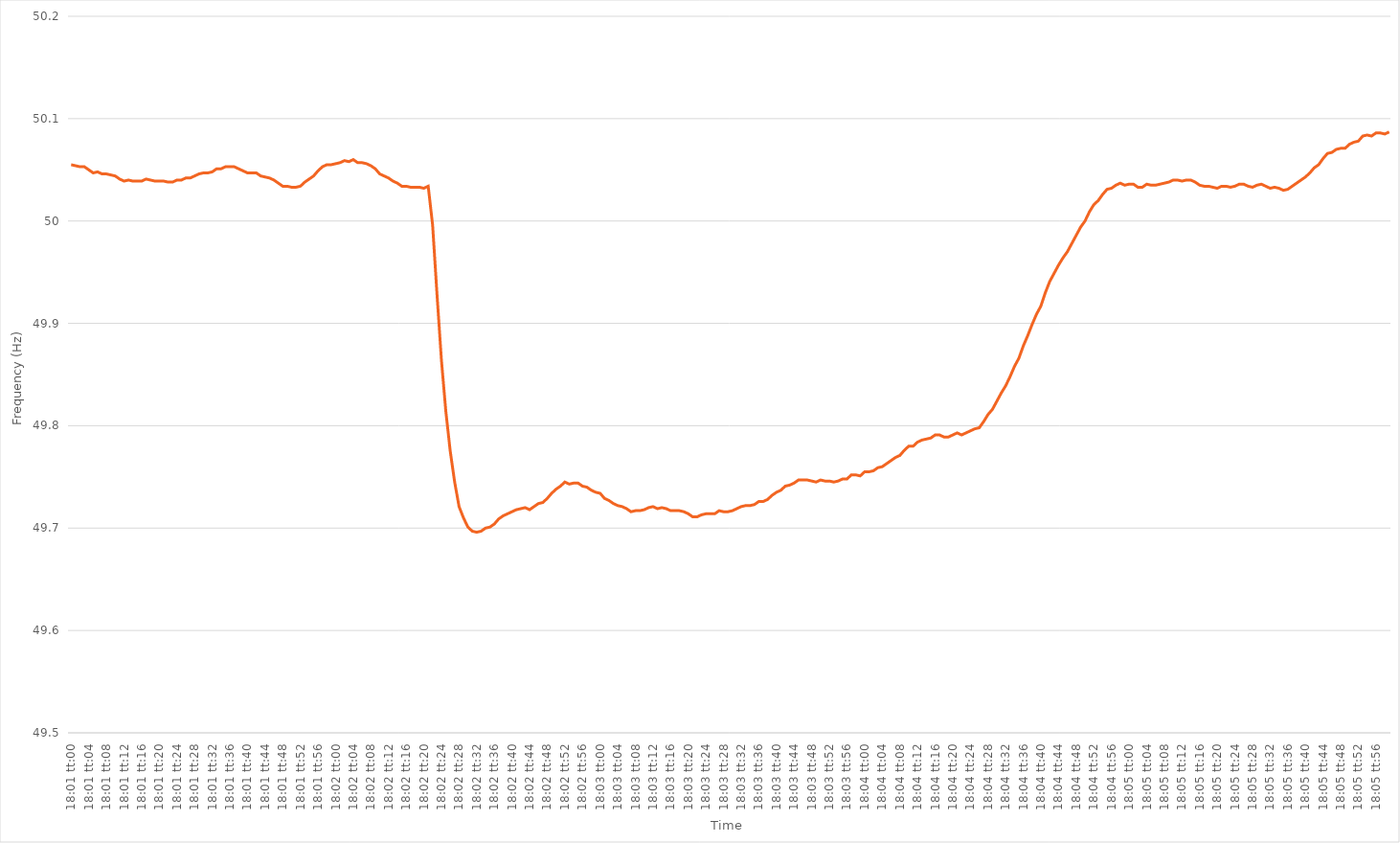
| Category | Series 0 |
|---|---|
| 0.7506944444444444 | 50.055 |
| 0.7507060185185185 | 50.054 |
| 0.7507175925925926 | 50.053 |
| 0.7507291666666666 | 50.053 |
| 0.7507407407407407 | 50.05 |
| 0.7507523148148149 | 50.047 |
| 0.7507638888888889 | 50.048 |
| 0.7507754629629629 | 50.046 |
| 0.750787037037037 | 50.046 |
| 0.7507986111111111 | 50.045 |
| 0.7508101851851853 | 50.044 |
| 0.7508217592592592 | 50.041 |
| 0.7508333333333334 | 50.039 |
| 0.7508449074074074 | 50.04 |
| 0.7508564814814815 | 50.039 |
| 0.7508680555555555 | 50.039 |
| 0.7508796296296296 | 50.039 |
| 0.7508912037037038 | 50.041 |
| 0.7509027777777778 | 50.04 |
| 0.7509143518518518 | 50.039 |
| 0.7509259259259259 | 50.039 |
| 0.7509375 | 50.039 |
| 0.750949074074074 | 50.038 |
| 0.7509606481481481 | 50.038 |
| 0.7509722222222223 | 50.04 |
| 0.7509837962962963 | 50.04 |
| 0.7509953703703703 | 50.042 |
| 0.7510069444444444 | 50.042 |
| 0.7510185185185185 | 50.044 |
| 0.7510300925925927 | 50.046 |
| 0.7510416666666666 | 50.047 |
| 0.7510532407407408 | 50.047 |
| 0.7510648148148148 | 50.048 |
| 0.751076388888889 | 50.051 |
| 0.7510879629629629 | 50.051 |
| 0.751099537037037 | 50.053 |
| 0.7511111111111112 | 50.053 |
| 0.7511226851851852 | 50.053 |
| 0.7511342592592593 | 50.051 |
| 0.7511458333333333 | 50.049 |
| 0.7511574074074074 | 50.047 |
| 0.7511689814814816 | 50.047 |
| 0.7511805555555555 | 50.047 |
| 0.7511921296296297 | 50.044 |
| 0.7512037037037037 | 50.043 |
| 0.7512152777777777 | 50.042 |
| 0.7512268518518518 | 50.04 |
| 0.7512384259259259 | 50.037 |
| 0.7512500000000001 | 50.034 |
| 0.751261574074074 | 50.034 |
| 0.7512731481481482 | 50.033 |
| 0.7512847222222222 | 50.033 |
| 0.7512962962962964 | 50.034 |
| 0.7513078703703703 | 50.038 |
| 0.7513194444444444 | 50.041 |
| 0.7513310185185186 | 50.044 |
| 0.7513425925925926 | 50.049 |
| 0.7513541666666667 | 50.053 |
| 0.7513657407407407 | 50.055 |
| 0.7513773148148148 | 50.055 |
| 0.751388888888889 | 50.056 |
| 0.7514004629629629 | 50.057 |
| 0.7514120370370371 | 50.059 |
| 0.7514236111111111 | 50.058 |
| 0.7514351851851852 | 50.06 |
| 0.7514467592592592 | 50.057 |
| 0.7514583333333333 | 50.057 |
| 0.7514699074074075 | 50.056 |
| 0.7514814814814814 | 50.054 |
| 0.7514930555555556 | 50.051 |
| 0.7515046296296296 | 50.046 |
| 0.7515162037037038 | 50.044 |
| 0.7515277777777777 | 50.042 |
| 0.7515393518518518 | 50.039 |
| 0.751550925925926 | 50.037 |
| 0.7515625 | 50.034 |
| 0.7515740740740741 | 50.034 |
| 0.7515856481481481 | 50.033 |
| 0.7515972222222222 | 50.033 |
| 0.7516087962962964 | 50.033 |
| 0.7516203703703703 | 50.032 |
| 0.7516319444444445 | 50.034 |
| 0.7516435185185185 | 49.996 |
| 0.7516550925925927 | 49.928 |
| 0.7516666666666666 | 49.864 |
| 0.7516782407407407 | 49.814 |
| 0.7516898148148149 | 49.775 |
| 0.7517013888888888 | 49.745 |
| 0.751712962962963 | 49.721 |
| 0.751724537037037 | 49.71 |
| 0.7517361111111112 | 49.701 |
| 0.7517476851851851 | 49.697 |
| 0.7517592592592592 | 49.696 |
| 0.7517708333333334 | 49.697 |
| 0.7517824074074074 | 49.7 |
| 0.7517939814814815 | 49.701 |
| 0.7518055555555555 | 49.704 |
| 0.7518171296296297 | 49.709 |
| 0.7518287037037038 | 49.712 |
| 0.7518402777777777 | 49.714 |
| 0.7518518518518519 | 49.716 |
| 0.7518634259259259 | 49.718 |
| 0.7518750000000001 | 49.719 |
| 0.751886574074074 | 49.72 |
| 0.7518981481481481 | 49.718 |
| 0.7519097222222223 | 49.721 |
| 0.7519212962962962 | 49.724 |
| 0.7519328703703704 | 49.725 |
| 0.7519444444444444 | 49.729 |
| 0.7519560185185186 | 49.734 |
| 0.7519675925925925 | 49.738 |
| 0.7519791666666666 | 49.741 |
| 0.7519907407407408 | 49.745 |
| 0.7520023148148148 | 49.743 |
| 0.7520138888888889 | 49.744 |
| 0.7520254629629629 | 49.744 |
| 0.7520370370370371 | 49.741 |
| 0.7520486111111112 | 49.74 |
| 0.7520601851851851 | 49.737 |
| 0.7520717592592593 | 49.735 |
| 0.7520833333333333 | 49.734 |
| 0.7520949074074075 | 49.729 |
| 0.7521064814814814 | 49.727 |
| 0.7521180555555556 | 49.724 |
| 0.7521296296296297 | 49.722 |
| 0.7521412037037036 | 49.721 |
| 0.7521527777777778 | 49.719 |
| 0.7521643518518518 | 49.716 |
| 0.752175925925926 | 49.717 |
| 0.7521874999999999 | 49.717 |
| 0.752199074074074 | 49.718 |
| 0.7522106481481482 | 49.72 |
| 0.7522222222222222 | 49.721 |
| 0.7522337962962963 | 49.719 |
| 0.7522453703703703 | 49.72 |
| 0.7522569444444445 | 49.719 |
| 0.7522685185185186 | 49.717 |
| 0.7522800925925925 | 49.717 |
| 0.7522916666666667 | 49.717 |
| 0.7523032407407407 | 49.716 |
| 0.7523148148148149 | 49.714 |
| 0.7523263888888888 | 49.711 |
| 0.752337962962963 | 49.711 |
| 0.7523495370370371 | 49.713 |
| 0.7523611111111111 | 49.714 |
| 0.7523726851851852 | 49.714 |
| 0.7523842592592592 | 49.714 |
| 0.7523958333333334 | 49.717 |
| 0.7524074074074073 | 49.716 |
| 0.7524189814814815 | 49.716 |
| 0.7524305555555556 | 49.717 |
| 0.7524421296296296 | 49.719 |
| 0.7524537037037037 | 49.721 |
| 0.7524652777777777 | 49.722 |
| 0.7524768518518519 | 49.722 |
| 0.752488425925926 | 49.723 |
| 0.7525 | 49.726 |
| 0.7525115740740741 | 49.726 |
| 0.7525231481481481 | 49.728 |
| 0.7525347222222223 | 49.732 |
| 0.7525462962962962 | 49.735 |
| 0.7525578703703704 | 49.737 |
| 0.7525694444444445 | 49.741 |
| 0.7525810185185186 | 49.742 |
| 0.7525925925925926 | 49.744 |
| 0.7526041666666666 | 49.747 |
| 0.7526157407407408 | 49.747 |
| 0.7526273148148147 | 49.747 |
| 0.7526388888888889 | 49.746 |
| 0.752650462962963 | 49.745 |
| 0.752662037037037 | 49.747 |
| 0.7526736111111111 | 49.746 |
| 0.7526851851851851 | 49.746 |
| 0.7526967592592593 | 49.745 |
| 0.7527083333333334 | 49.746 |
| 0.7527199074074074 | 49.748 |
| 0.7527314814814815 | 49.748 |
| 0.7527430555555555 | 49.752 |
| 0.7527546296296297 | 49.752 |
| 0.7527662037037036 | 49.751 |
| 0.7527777777777778 | 49.755 |
| 0.7527893518518519 | 49.755 |
| 0.752800925925926 | 49.756 |
| 0.7528125 | 49.759 |
| 0.752824074074074 | 49.76 |
| 0.7528356481481482 | 49.763 |
| 0.7528472222222221 | 49.766 |
| 0.7528587962962963 | 49.769 |
| 0.7528703703703704 | 49.771 |
| 0.7528819444444445 | 49.776 |
| 0.7528935185185185 | 49.78 |
| 0.7529050925925925 | 49.78 |
| 0.7529166666666667 | 49.784 |
| 0.7529282407407408 | 49.786 |
| 0.7529398148148148 | 49.787 |
| 0.7529513888888889 | 49.788 |
| 0.752962962962963 | 49.791 |
| 0.7529745370370371 | 49.791 |
| 0.752986111111111 | 49.789 |
| 0.7529976851851852 | 49.789 |
| 0.7530092592592593 | 49.791 |
| 0.7530208333333334 | 49.793 |
| 0.7530324074074074 | 49.791 |
| 0.7530439814814814 | 49.793 |
| 0.7530555555555556 | 49.795 |
| 0.7530671296296297 | 49.797 |
| 0.7530787037037037 | 49.798 |
| 0.7530902777777778 | 49.804 |
| 0.7531018518518519 | 49.811 |
| 0.7531134259259259 | 49.816 |
| 0.7531249999999999 | 49.824 |
| 0.7531365740740741 | 49.832 |
| 0.7531481481481482 | 49.839 |
| 0.7531597222222222 | 49.848 |
| 0.7531712962962963 | 49.858 |
| 0.7531828703703703 | 49.866 |
| 0.7531944444444445 | 49.878 |
| 0.7532060185185184 | 49.888 |
| 0.7532175925925926 | 49.899 |
| 0.7532291666666667 | 49.909 |
| 0.7532407407407408 | 49.917 |
| 0.7532523148148148 | 49.93 |
| 0.7532638888888888 | 49.941 |
| 0.753275462962963 | 49.949 |
| 0.7532870370370371 | 49.957 |
| 0.7532986111111111 | 49.964 |
| 0.7533101851851852 | 49.97 |
| 0.7533217592592593 | 49.978 |
| 0.7533333333333333 | 49.986 |
| 0.7533449074074073 | 49.994 |
| 0.7533564814814815 | 50 |
| 0.7533680555555556 | 50.009 |
| 0.7533796296296296 | 50.016 |
| 0.7533912037037037 | 50.02 |
| 0.7534027777777778 | 50.026 |
| 0.7534143518518519 | 50.031 |
| 0.7534259259259258 | 50.032 |
| 0.7534375 | 50.035 |
| 0.7534490740740741 | 50.037 |
| 0.7534606481481482 | 50.035 |
| 0.7534722222222222 | 50.036 |
| 0.7534837962962962 | 50.036 |
| 0.7534953703703704 | 50.033 |
| 0.7535069444444445 | 50.033 |
| 0.7535185185185185 | 50.036 |
| 0.7535300925925926 | 50.035 |
| 0.7535416666666667 | 50.035 |
| 0.7535532407407407 | 50.036 |
| 0.7535648148148147 | 50.037 |
| 0.7535763888888889 | 50.038 |
| 0.753587962962963 | 50.04 |
| 0.753599537037037 | 50.04 |
| 0.7536111111111111 | 50.039 |
| 0.7536226851851852 | 50.04 |
| 0.7536342592592593 | 50.04 |
| 0.7536458333333332 | 50.038 |
| 0.7536574074074074 | 50.035 |
| 0.7536689814814815 | 50.034 |
| 0.7536805555555556 | 50.034 |
| 0.7536921296296296 | 50.033 |
| 0.7537037037037037 | 50.032 |
| 0.7537152777777778 | 50.034 |
| 0.753726851851852 | 50.034 |
| 0.7537384259259259 | 50.033 |
| 0.75375 | 50.034 |
| 0.7537615740740741 | 50.036 |
| 0.7537731481481482 | 50.036 |
| 0.7537847222222221 | 50.034 |
| 0.7537962962962963 | 50.033 |
| 0.7538078703703704 | 50.035 |
| 0.7538194444444444 | 50.036 |
| 0.7538310185185185 | 50.034 |
| 0.7538425925925926 | 50.032 |
| 0.7538541666666667 | 50.033 |
| 0.7538657407407406 | 50.032 |
| 0.7538773148148148 | 50.03 |
| 0.7538888888888889 | 50.031 |
| 0.753900462962963 | 50.034 |
| 0.753912037037037 | 50.037 |
| 0.7539236111111111 | 50.04 |
| 0.7539351851851852 | 50.043 |
| 0.7539467592592594 | 50.047 |
| 0.7539583333333333 | 50.052 |
| 0.7539699074074074 | 50.055 |
| 0.7539814814814815 | 50.061 |
| 0.7539930555555556 | 50.066 |
| 0.7540046296296296 | 50.067 |
| 0.7540162037037037 | 50.07 |
| 0.7540277777777779 | 50.071 |
| 0.7540393518518518 | 50.071 |
| 0.7540509259259259 | 50.075 |
| 0.7540625 | 50.077 |
| 0.7540740740740741 | 50.078 |
| 0.754085648148148 | 50.083 |
| 0.7540972222222222 | 50.084 |
| 0.7541087962962963 | 50.083 |
| 0.7541203703703704 | 50.086 |
| 0.7541319444444444 | 50.086 |
| 0.7541435185185185 | 50.085 |
| 0.7541550925925926 | 50.087 |